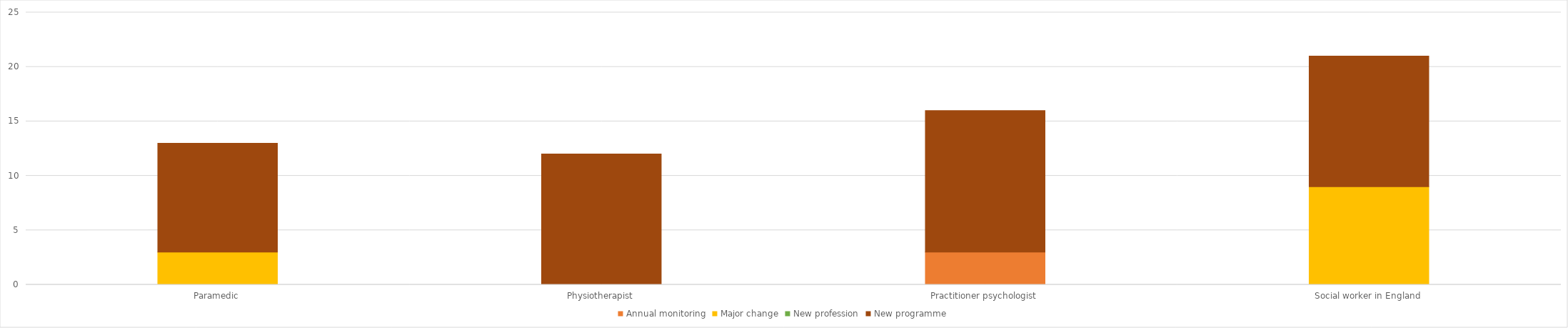
| Category | Annual monitoring | Major change | New profession | New programme |
|---|---|---|---|---|
| Paramedic | 0 | 3 | 0 | 10 |
| Physiotherapist | 0 | 0 | 0 | 12 |
| Practitioner psychologist | 3 | 0 | 0 | 13 |
| Social worker in England | 0 | 9 | 0 | 12 |